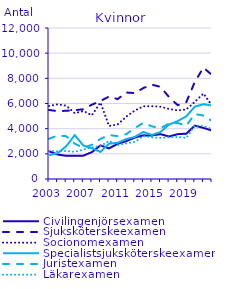
| Category | Civilingenjörsexamen                               | Sjuksköterskeexamen                                | Socionomexamen                                     | Specialistsjuksköterskeexamen                      | Juristexamen                                       | Läkarexamen                                        |
|---|---|---|---|---|---|---|
| 2003.0 | 2208 | 5489 | 5799 | 1891 | 3195 | 2233 |
| 2004.0 | 1943 | 5389 | 5932 | 2050 | 3452 | 2200 |
| 2005.0 | 1845 | 5421 | 5830 | 2597 | 3401 | 2227 |
| 2006.0 | 1845 | 5472 | 5237 | 3488 | 2808 | 2158 |
| 2007.0 | 1855 | 5538 | 5394 | 2666 | 2479 | 2334 |
| 2008.0 | 2138 | 5907 | 5070 | 2443 | 2718 | 2526 |
| 2009.0 | 2666 | 6195 | 6074 | 2153 | 3188 | 2612 |
| 2010.0 | 2431 | 6556 | 4210 | 2808 | 3494 | 3023 |
| 2011.0 | 2797 | 6351 | 4335 | 2879 | 3407 | 2688 |
| 2012.0 | 3006 | 6873 | 4953 | 3168 | 3564 | 2836 |
| 2013.0 | 3292 | 6826 | 5436 | 3343 | 4036 | 2951 |
| 2014.0 | 3468 | 7229 | 5780 | 3736 | 4468 | 3411 |
| 2015.0 | 3461 | 7497 | 5787 | 3499 | 4184 | 3311 |
| 2016.0 | 3562 | 7321 | 5745 | 3738 | 4036 | 3263 |
| 2017.0 | 3378 | 6502 | 5564 | 4332 | 4410 | 3323 |
| 2018.0 | 3563 | 5866 | 5451 | 4601 | 4448 | 3343 |
| 2019.0 | 3602 | 6102 | 5528 | 4976 | 4237 | 3254 |
| 2020.0 | 4242 | 7722 | 6133 | 5757 | 5166 | 4250 |
| 2021.0 | 4061 | 8850 | 6791 | 5938 | 5041 | 4218 |
| 2022.0 | 3853 | 8263 | 5841 | 5839 | 4608 | 3953 |